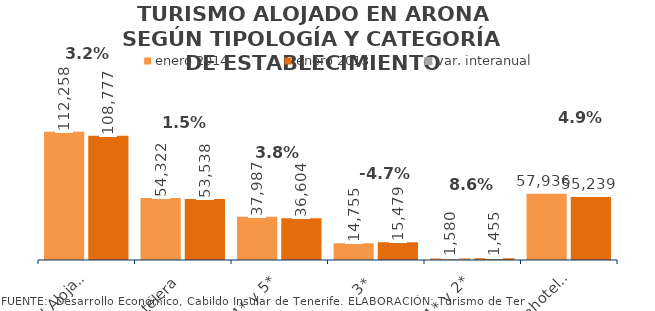
| Category | enero 2014 | enero 2013 |
|---|---|---|
| Total Alojados | 112258 | 108777 |
| Hotelera | 54322 | 53538 |
| 4* y 5* | 37987 | 36604 |
| 3* | 14755 | 15479 |
| 1* y 2* | 1580 | 1455 |
| Extrahotelera | 57936 | 55239 |